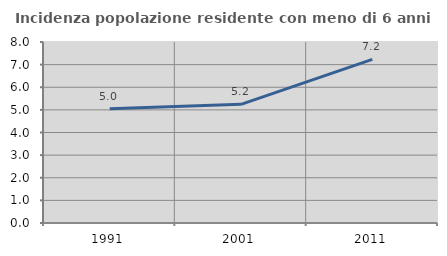
| Category | Incidenza popolazione residente con meno di 6 anni |
|---|---|
| 1991.0 | 5.048 |
| 2001.0 | 5.244 |
| 2011.0 | 7.234 |